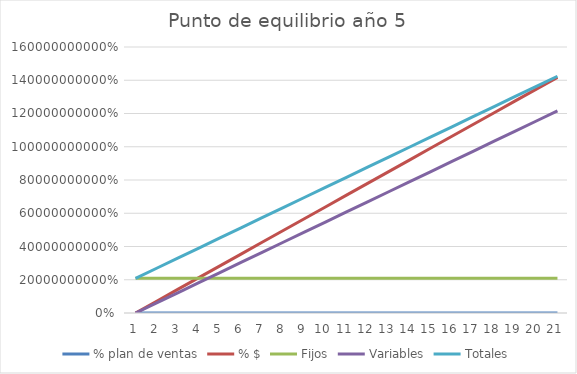
| Category | % plan de ventas | % $ | Fijos | Variables | Totales |
|---|---|---|---|---|---|
| 0 | 0 | 0 | 208358740.14 | 0 | 208358740.14 |
| 1 | 0.05 | 70875000 | 208358740.14 | 60784997.637 | 269143737.778 |
| 2 | 0.1 | 141750000 | 208358740.14 | 121569995.275 | 329928735.415 |
| 3 | 0.15 | 212625000 | 208358740.14 | 182354992.912 | 390713733.053 |
| 4 | 0.2 | 283500000 | 208358740.14 | 243139990.549 | 451498730.69 |
| 5 | 0.25 | 354375000 | 208358740.14 | 303924988.187 | 512283728.327 |
| 6 | 0.3 | 425250000 | 208358740.14 | 364709985.824 | 573068725.965 |
| 7 | 0.35 | 496125000 | 208358740.14 | 425494983.461 | 633853723.602 |
| 8 | 0.4 | 567000000 | 208358740.14 | 486279981.099 | 694638721.239 |
| 9 | 0.45 | 637875000 | 208358740.14 | 547064978.736 | 755423718.877 |
| 10 | 0.5 | 708750000 | 208358740.14 | 607849976.374 | 816208716.514 |
| 11 | 0.55 | 779625000 | 208358740.14 | 668634974.011 | 876993714.151 |
| 12 | 0.6 | 850500000 | 208358740.14 | 729419971.648 | 937778711.789 |
| 13 | 0.65 | 921375000 | 208358740.14 | 790204969.286 | 998563709.426 |
| 14 | 0.7 | 992250000 | 208358740.14 | 850989966.923 | 1059348707.063 |
| 15 | 0.75 | 1063125000 | 208358740.14 | 911774964.56 | 1120133704.701 |
| 16 | 0.8 | 1134000000 | 208358740.14 | 972559962.198 | 1180918702.338 |
| 17 | 0.85 | 1204875000 | 208358740.14 | 1033344959.835 | 1241703699.975 |
| 18 | 0.9 | 1275750000 | 208358740.14 | 1094129957.472 | 1302488697.613 |
| 19 | 0.95 | 1346625000 | 208358740.14 | 1154914955.11 | 1363273695.25 |
| 20 | 1 | 1417500000 | 208358740.14 | 1215699952.747 | 1424058692.888 |